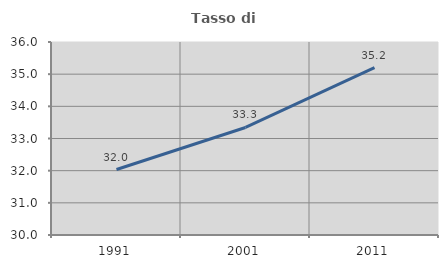
| Category | Tasso di occupazione   |
|---|---|
| 1991.0 | 32.035 |
| 2001.0 | 33.343 |
| 2011.0 | 35.205 |